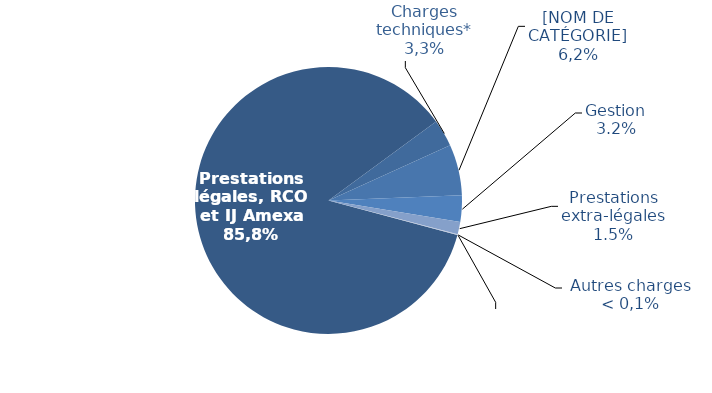
| Category | Series 0 |
|---|---|
| Prestations légales | 14285.787 |
| Charges techniques* | 549.897 |
| Dotations aux provisions | 1024.716 |
| Gestion | 534.22 |
| Prestations extra-légales | 246.261 |
| Autres charges | 9.951 |
| Charges financières | 7.991 |